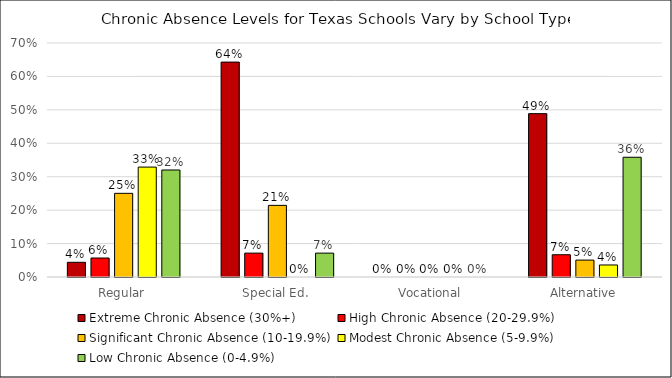
| Category | Extreme Chronic Absence (30%+) | High Chronic Absence (20-29.9%) | Significant Chronic Absence (10-19.9%) | Modest Chronic Absence (5-9.9%) | Low Chronic Absence (0-4.9%) |
|---|---|---|---|---|---|
| Regular | 0.044 | 0.057 | 0.25 | 0.329 | 0.32 |
| Special Ed. | 0.643 | 0.071 | 0.214 | 0 | 0.071 |
| Vocational | 0 | 0 | 0 | 0 | 0 |
| Alternative | 0.489 | 0.067 | 0.051 | 0.036 | 0.358 |